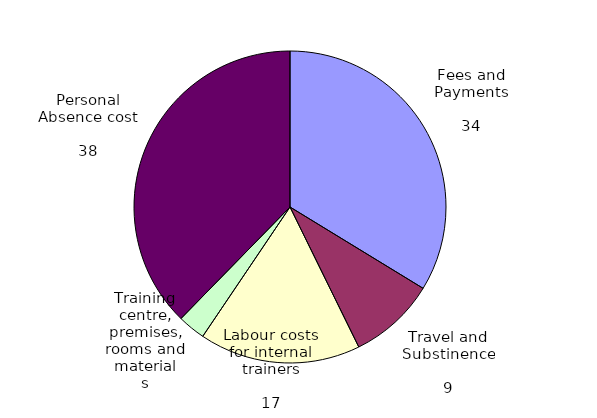
| Category | Series 0 |
|---|---|
| Fees and Payments | 0.341 |
| Travel and Subsistence | 0.091 |
| Labour costs for internal trainers | 0.169 |
| Training centre, premises, rooms and materials | 0.029 |
| Personal Absence cost | 0.381 |